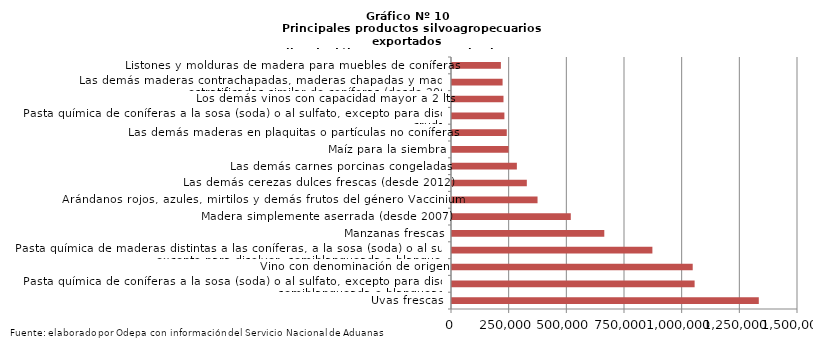
| Category | Series 0 |
|---|---|
| Uvas frescas | 1330052.969 |
| Pasta química de coníferas a la sosa (soda) o al sulfato, excepto para disolver, semiblanqueada o blanqueada | 1051803.574 |
| Vino con denominación de origen | 1043576.781 |
| Pasta química de maderas distintas a las coníferas, a la sosa (soda) o al sulfato, excepto para disolver, semiblanqueada o blanqueada | 868761.595 |
| Manzanas frescas | 660241.541 |
| Madera simplemente aserrada (desde 2007) | 514983.353 |
| Arándanos rojos, azules, mirtilos y demás frutos del género Vaccinium | 370835.618 |
| Las demás cerezas dulces frescas (desde 2012) | 324386.785 |
| Las demás carnes porcinas congeladas | 281241.704 |
| Maíz para la siembra | 245146.96 |
| Las demás maderas en plaquitas o partículas no coníferas | 237485.004 |
| Pasta química de coníferas a la sosa (soda) o al sulfato, excepto para disolver, cruda | 227144.382 |
| Los demás vinos con capacidad mayor a 2 lts | 223190.323 |
| Las demás maderas contrachapadas, maderas chapadas y maderas estratificadas similar de coníferas (desde 2007) | 219328.146 |
| Listones y molduras de madera para muebles de coníferas | 211937.8 |